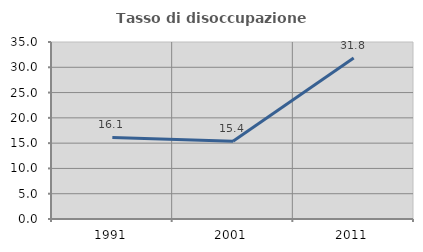
| Category | Tasso di disoccupazione giovanile  |
|---|---|
| 1991.0 | 16.129 |
| 2001.0 | 15.385 |
| 2011.0 | 31.818 |